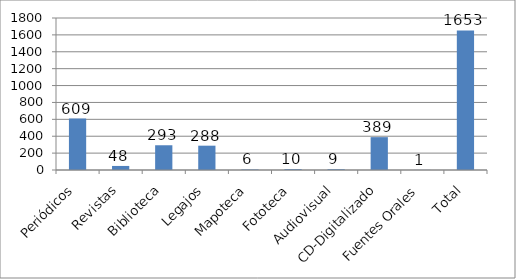
| Category | Series 0 |
|---|---|
| Periódicos | 609 |
| Revistas | 48 |
| Biblioteca | 293 |
| Legajos | 288 |
| Mapoteca | 6 |
| Fototeca | 10 |
| Audiovisual | 9 |
| CD-Digitalizado | 389 |
| Fuentes Orales | 1 |
| Total | 1653 |